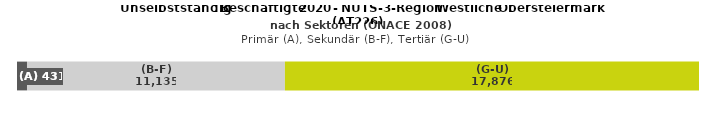
| Category | (A) | (B-F) | (G-U) |
|---|---|---|---|
| 0 | 431 | 11135 | 17876 |